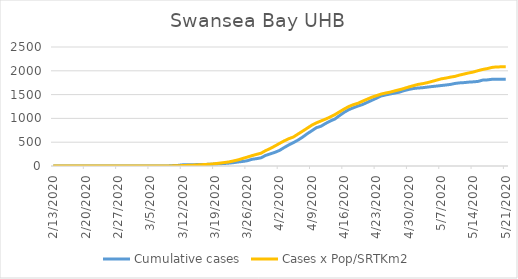
| Category | Cumulative cases | Cases x Pop/SRTKm2 |
|---|---|---|
| 5/21/20 | 1825 | 2082.576 |
| 5/20/20 | 1825 | 2082.576 |
| 5/19/20 | 1825 | 2082.087 |
| 5/18/20 | 1821 | 2070.672 |
| 5/17/20 | 1809 | 2046.374 |
| 5/16/20 | 1804 | 2028.273 |
| 5/15/20 | 1777 | 2002.834 |
| 5/14/20 | 1768 | 1974.623 |
| 5/13/20 | 1762 | 1955.055 |
| 5/12/20 | 1752 | 1932.551 |
| 5/11/20 | 1746 | 1910.21 |
| 5/10/20 | 1734 | 1882.488 |
| 5/9/20 | 1713 | 1866.344 |
| 5/8/20 | 1701 | 1846.123 |
| 5/7/20 | 1690 | 1829.816 |
| 5/6/20 | 1679 | 1802.91 |
| 5/5/20 | 1669 | 1776.003 |
| 5/4/20 | 1657 | 1750.075 |
| 5/3/20 | 1645 | 1729.202 |
| 5/2/20 | 1638 | 1713.873 |
| 5/1/20 | 1628 | 1686.64 |
| 4/30/20 | 1608 | 1660.875 |
| 4/29/20 | 1584 | 1629.565 |
| 4/28/20 | 1552 | 1602.985 |
| 4/27/20 | 1532 | 1579.177 |
| 4/26/20 | 1514 | 1552.433 |
| 4/25/20 | 1493 | 1533.028 |
| 4/24/20 | 1471 | 1511.013 |
| 4/23/20 | 1424 | 1477.257 |
| 4/22/20 | 1380 | 1444.969 |
| 4/21/20 | 1336 | 1404.039 |
| 4/20/20 | 1292 | 1362.782 |
| 4/19/20 | 1260 | 1317.937 |
| 4/18/20 | 1223 | 1288.911 |
| 4/17/20 | 1183 | 1249.285 |
| 4/16/20 | 1127 | 1196.776 |
| 4/15/20 | 1059 | 1138.233 |
| 4/14/20 | 987 | 1080.343 |
| 4/13/20 | 945 | 1029.791 |
| 4/12/20 | 894 | 986.252 |
| 4/11/20 | 836 | 946.625 |
| 4/10/20 | 805 | 906.836 |
| 4/9/20 | 740 | 857.915 |
| 4/8/20 | 678 | 794.317 |
| 4/7/20 | 606 | 731.861 |
| 4/6/20 | 544 | 670.547 |
| 4/5/20 | 490 | 608.743 |
| 4/4/20 | 442 | 572.704 |
| 4/3/20 | 387 | 526.881 |
| 4/2/20 | 327 | 474.047 |
| 4/1/20 | 287 | 419.744 |
| 3/31/20 | 254 | 367.561 |
| 3/30/20 | 223 | 323.369 |
| 3/29/20 | 172 | 268.904 |
| 3/28/20 | 154 | 243.465 |
| 3/27/20 | 140 | 216.395 |
| 3/26/20 | 110 | 186.227 |
| 3/25/20 | 95 | 157.852 |
| 3/24/20 | 84 | 128.01 |
| 3/23/20 | 70 | 105.996 |
| 3/22/20 | 60 | 84.797 |
| 3/21/20 | 52 | 72.403 |
| 3/20/20 | 47 | 60.173 |
| 3/19/20 | 41 | 48.432 |
| 3/18/20 | 36 | 38.648 |
| 3/17/20 | 33 | 32.94 |
| 3/16/20 | 31 | 26.907 |
| 3/15/20 | 29 | 21.362 |
| 3/14/20 | 28 | 16.633 |
| 3/13/20 | 28 | 13.535 |
| 3/12/20 | 24 | 9.132 |
| 3/11/20 | 13 | 5.218 |
| 3/10/20 | 9 | 2.935 |
| 3/9/20 | 2 | 1.141 |
| 3/8/20 | 2 | 0.652 |
| 3/7/20 | 2 | 0.652 |
| 3/6/20 | 1 | 0.326 |
| 3/5/20 | 1 | 0.326 |
| 3/4/20 | 1 | 0.326 |
| 3/3/20 | 1 | 0.163 |
| 3/2/20 | 1 | 0.163 |
| 3/1/20 | 1 | 0.163 |
| 2/29/20 | 1 | 0.163 |
| 2/28/20 | 1 | 0.163 |
| 2/27/20 | 1 | 0.163 |
| 2/26/20 | 0 | 0 |
| 2/25/20 | 0 | 0 |
| 2/24/20 | 0 | 0 |
| 2/23/20 | 0 | 0 |
| 2/22/20 | 0 | 0 |
| 2/21/20 | 0 | 0 |
| 2/20/20 | 0 | 0 |
| 2/19/20 | 0 | 0 |
| 2/18/20 | 0 | 0 |
| 2/17/20 | 0 | 0 |
| 2/16/20 | 0 | 0 |
| 2/15/20 | 0 | 0 |
| 2/14/20 | 0 | 0 |
| 2/13/20 | 0 | 0 |